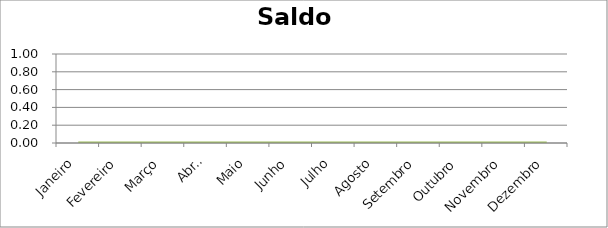
| Category | Saldo |
|---|---|
| Janeiro | 0 |
| Fevereiro | 0 |
| Março | 0 |
| Abril | 0 |
| Maio | 0 |
| Junho | 0 |
| Julho | 0 |
| Agosto | 0 |
| Setembro | 0 |
| Outubro | 0 |
| Novembro | 0 |
| Dezembro | 0 |